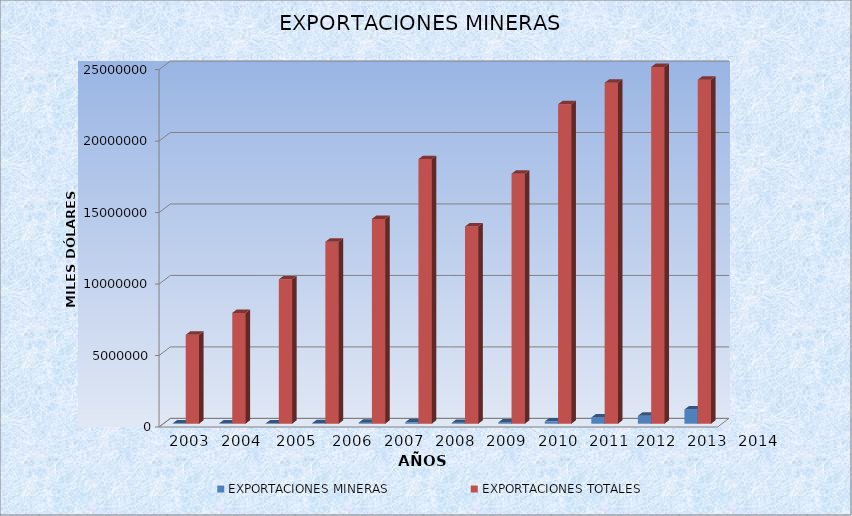
| Category | EXPORTACIONES MINERAS | EXPORTACIONES TOTALES |
|---|---|---|
| 0 | 11879 | 6222693 |
| 1 | 12461 | 7752892 |
| 2 | 15936 | 10100031 |
| 3 | 36036 | 12728243 |
| 4 | 69522.69 | 14327105 |
| 5 | 98282.7 | 18510598 |
| 6 | 62913.84 | 13799022.74 |
| 7 | 89638.75 | 17489923 |
| 8 | 164737 | 22345205 |
| 9 | 437514.19 | 23852016 |
| 10 | 555914.84 | 24957645 |
| 11 | 998802.24 | 24064238 |